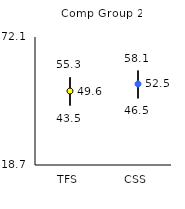
| Category | 25th | 75th | Mean |
|---|---|---|---|
| TFS | 43.5 | 55.3 | 49.56 |
| CSS | 46.5 | 58.1 | 52.53 |